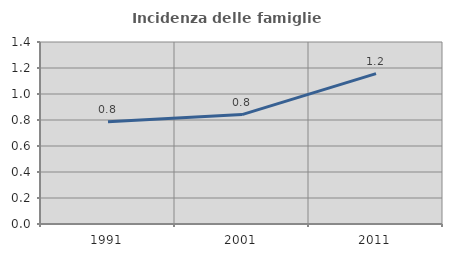
| Category | Incidenza delle famiglie numerose |
|---|---|
| 1991.0 | 0.787 |
| 2001.0 | 0.842 |
| 2011.0 | 1.157 |